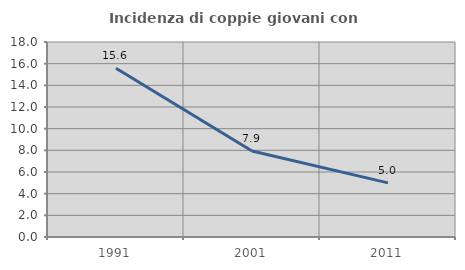
| Category | Incidenza di coppie giovani con figli |
|---|---|
| 1991.0 | 15.584 |
| 2001.0 | 7.941 |
| 2011.0 | 4.994 |